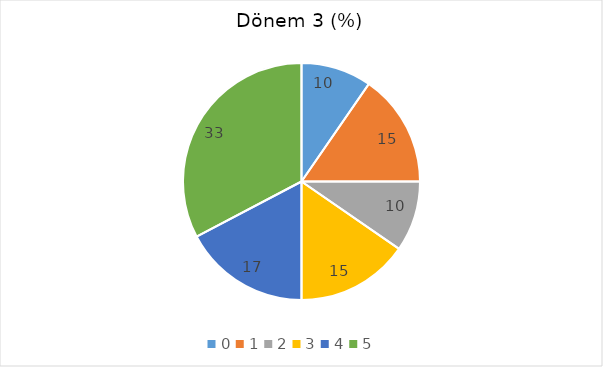
| Category | Dönem 3 (%) |
|---|---|
| 0.0 | 9.615 |
| 1.0 | 15.385 |
| 2.0 | 9.615 |
| 3.0 | 15.385 |
| 4.0 | 17.308 |
| 5.0 | 32.692 |